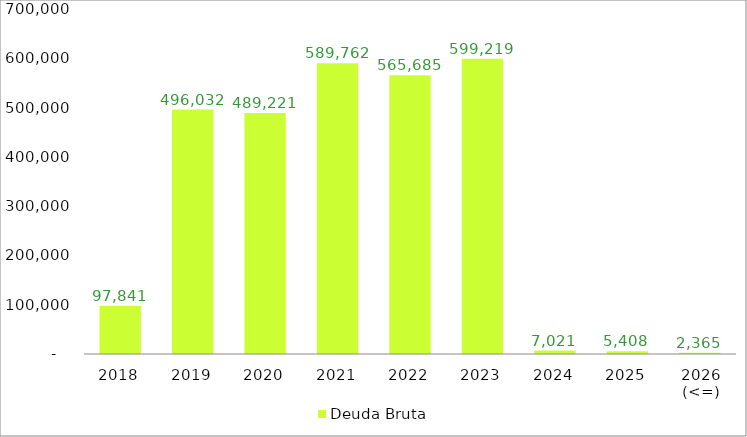
| Category | Deuda Bruta |
|---|---|
| 2018 | 97840.66 |
| 2019 | 496032.06 |
| 2020 | 489220.634 |
| 2021 | 589762.03 |
| 2022 | 565684.544 |
| 2023 | 599219.482 |
| 2024 | 7021.369 |
| 2025 | 5407.91 |
| 2026 (<=) | 2364.721 |